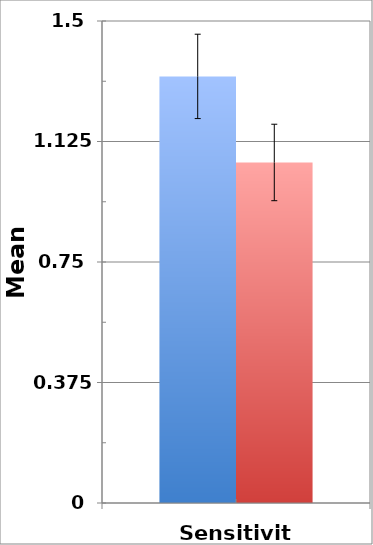
| Category | Low Unusual Experiences score | High Unusual Experiences score |
|---|---|---|
| Sensitivity | 1.328 | 1.06 |